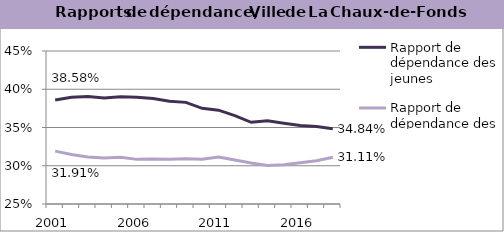
| Category | Rapport de dépendance des jeunes | Rapport de dépendance des personnes âgées |
|---|---|---|
| 2001.0 | 0.386 | 0.319 |
| 2002.0 | 0.39 | 0.315 |
| 2003.0 | 0.39 | 0.311 |
| 2004.0 | 0.389 | 0.31 |
| 2005.0 | 0.39 | 0.311 |
| 2006.0 | 0.39 | 0.308 |
| 2007.0 | 0.388 | 0.309 |
| 2008.0 | 0.384 | 0.308 |
| 2009.0 | 0.383 | 0.309 |
| 2010.0 | 0.375 | 0.308 |
| 2011.0 | 0.373 | 0.311 |
| 2012.0 | 0.366 | 0.308 |
| 2013.0 | 0.357 | 0.304 |
| 2014.0 | 0.359 | 0.3 |
| 2015.0 | 0.355 | 0.301 |
| 2016.0 | 0.353 | 0.304 |
| 2017.0 | 0.351 | 0.307 |
| 2018.0 | 0.348 | 0.311 |